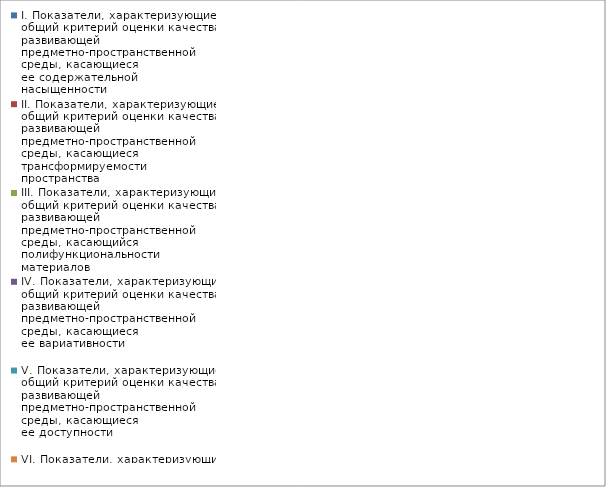
| Category | I. Показатели, характеризующие общий критерий оценки качества развивающей предметно-пространственной среды, касающиеся ее содержательной насыщенности | II. Показатели, характеризующие общий критерий оценки качества развивающей предметно-пространственной среды, касающиеся трансформируемости пространства | III. Показатели, характеризующие общий критерий оценки качества развивающей предметно-пространственной среды, касающийся полифункциональности материалов | IV. Показатели, характеризующие общий критерий оценки качества развивающей предметно-пространственной среды, касающиеся ее вариативности | V. Показатели, характеризующие общий критерий оценки качества развивающей предметно-пространственной среды, касающиеся ее доступности | VI. Показатели, характеризующие общий критерий оценки качества развивающей предметно-пространственной среды, касающиеся безопасности предметно-пространственной среды |
|---|---|---|---|---|---|---|
| Гномики | 1 | 0.667 | 0.667 | 0.889 | 1 | 0.95 |